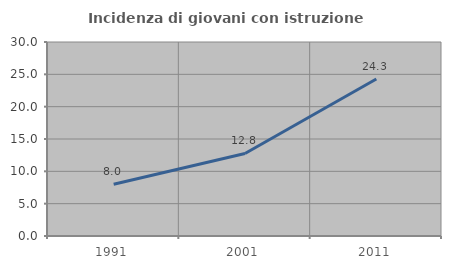
| Category | Incidenza di giovani con istruzione universitaria |
|---|---|
| 1991.0 | 7.997 |
| 2001.0 | 12.761 |
| 2011.0 | 24.282 |